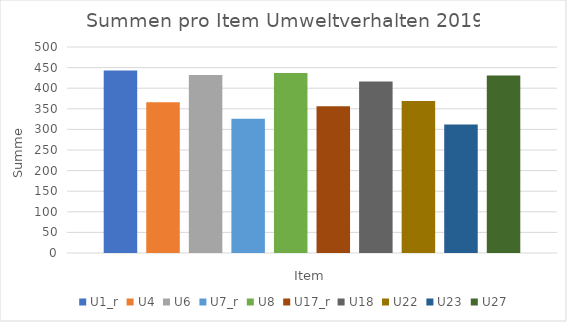
| Category | U1_r | U4 | U6 | U7_r | U8 | U17_r | U18 | U22 | U23 | U27 |
|---|---|---|---|---|---|---|---|---|---|---|
| 0 | 443 | 366 | 432 | 326 | 437 | 356 | 416 | 369 | 312 | 431 |